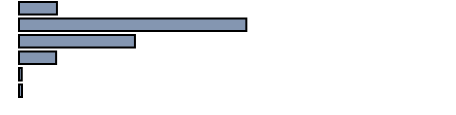
| Category | Series 0 |
|---|---|
| 0 | 8.948 |
| 1 | 53.617 |
| 2 | 27.344 |
| 3 | 8.755 |
| 4 | 0.64 |
| 5 | 0.697 |